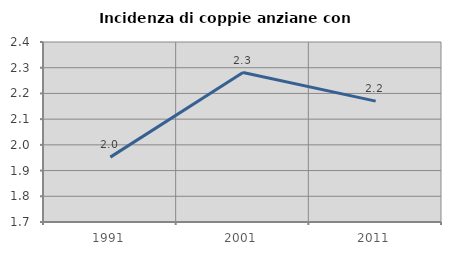
| Category | Incidenza di coppie anziane con figli |
|---|---|
| 1991.0 | 1.952 |
| 2001.0 | 2.281 |
| 2011.0 | 2.17 |